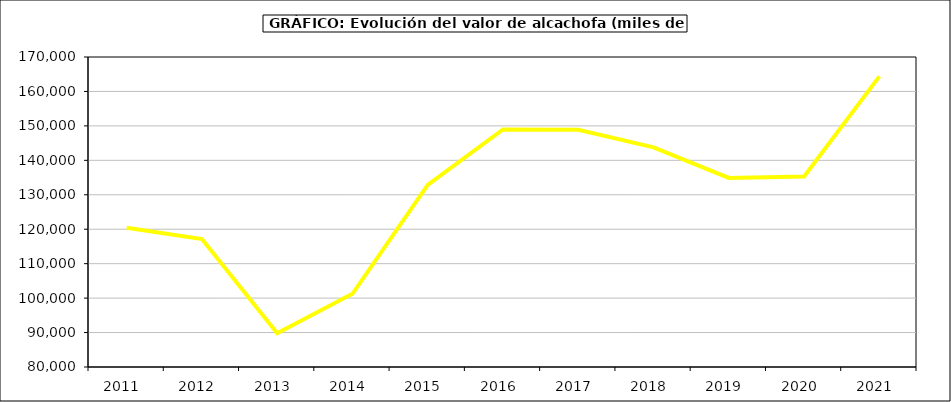
| Category | Valor |
|---|---|
| 2011.0 | 120418 |
| 2012.0 | 117146.597 |
| 2013.0 | 89795.299 |
| 2014.0 | 101254.898 |
| 2015.0 | 132897 |
| 2016.0 | 148974 |
| 2017.0 | 148863.365 |
| 2018.0 | 143776.931 |
| 2019.0 | 134882.222 |
| 2020.0 | 135314.955 |
| 2021.0 | 164370.586 |